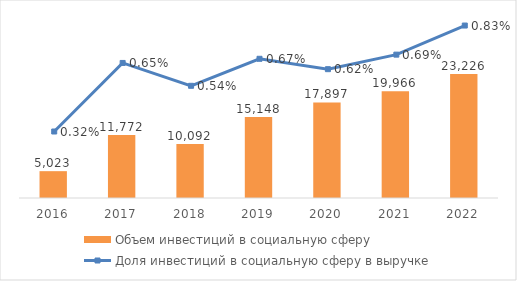
| Category | Объем инвестиций в социальную сферу |
|---|---|
| 2016.0 | 5023 |
| 2017.0 | 11772 |
| 2018.0 | 10092.129 |
| 2019.0 | 15148.373 |
| 2020.0 | 17897.476 |
| 2021.0 | 19965.927 |
| 2022.0 | 23226.005 |